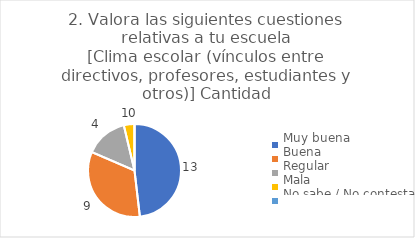
| Category | 2. Valora las siguientes cuestiones relativas a tu escuela
[Clima escolar (vínculos entre directivos, profesores, estudiantes y otros)] |
|---|---|
| Muy buena  | 0.481 |
| Buena  | 0.333 |
| Regular  | 0.148 |
| Mala  | 0.037 |
| No sabe / No contesta | 0 |